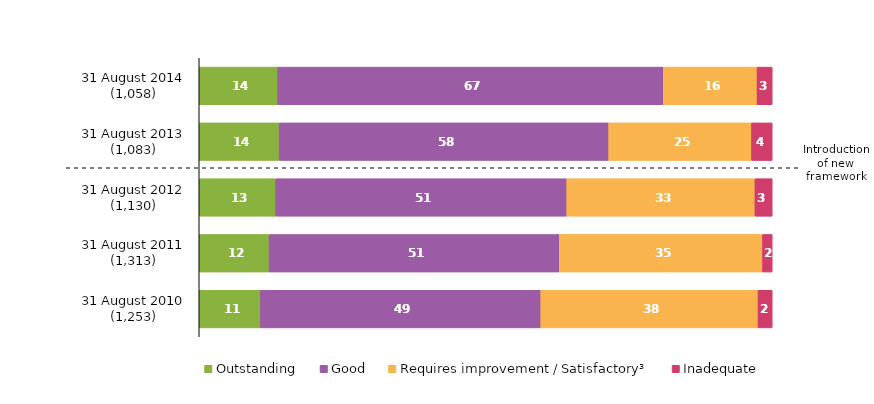
| Category | Outstanding | Good | Requires improvement / Satisfactory³ | Inadequate |
|---|---|---|---|---|
| 31 August 2014 (1,058) | 13.705 | 67.297 | 16.352 | 2.647 |
| 31 August 2013 (1,083) | 13.943 | 57.525 | 24.931 | 3.601 |
| 31 August 2012 (1,130) | 13.363 | 50.796 | 32.832 | 3.009 |
| 31 August 2011 (1,313) | 12.186 | 50.647 | 35.491 | 1.676 |
| 31 August 2010 (1,253) | 10.694 | 48.923 | 37.909 | 2.474 |